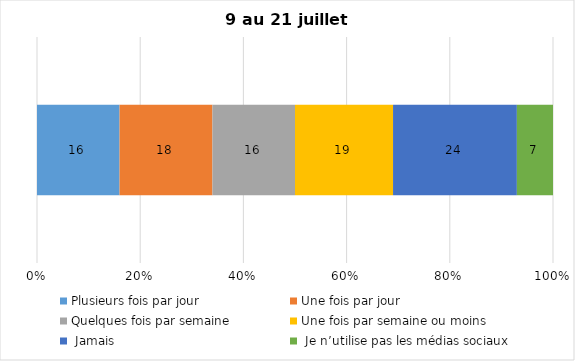
| Category | Plusieurs fois par jour | Une fois par jour | Quelques fois par semaine   | Une fois par semaine ou moins   |  Jamais   |  Je n’utilise pas les médias sociaux |
|---|---|---|---|---|---|---|
| 0 | 16 | 18 | 16 | 19 | 24 | 7 |